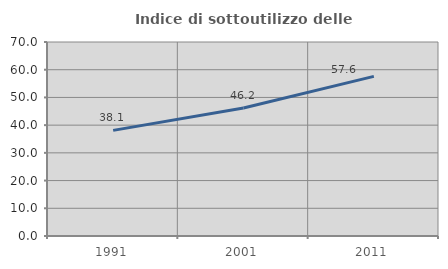
| Category | Indice di sottoutilizzo delle abitazioni  |
|---|---|
| 1991.0 | 38.116 |
| 2001.0 | 46.21 |
| 2011.0 | 57.595 |